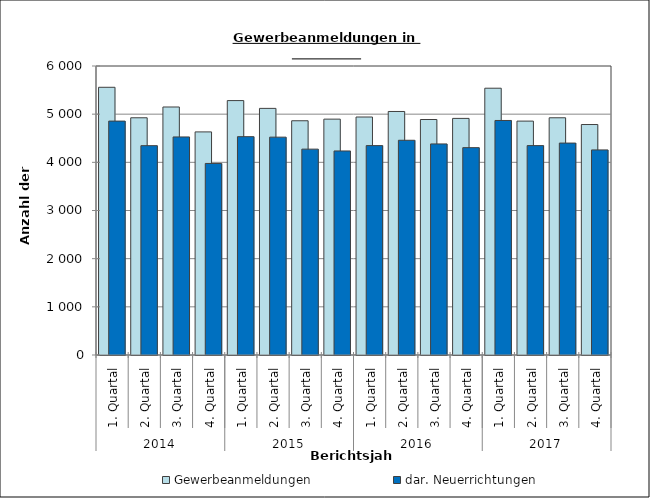
| Category | Gewerbeanmeldungen | dar. Neuerrichtungen |
|---|---|---|
| 0 | 5558 | 4856 |
| 1 | 4925 | 4346 |
| 2 | 5149 | 4527 |
| 3 | 4632 | 3977 |
| 4 | 5282 | 4533 |
| 5 | 5120 | 4523 |
| 6 | 4863 | 4274 |
| 7 | 4897 | 4236 |
| 8 | 4941 | 4347 |
| 9 | 5056 | 4458 |
| 10 | 4889 | 4382 |
| 11 | 4912 | 4305 |
| 12 | 5539 | 4869 |
| 13 | 4856 | 4347 |
| 14 | 4925 | 4400 |
| 15 | 4785 | 4258 |